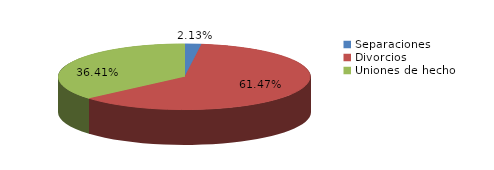
| Category | Series 0 |
|---|---|
| Separaciones | 9 |
| Divorcios | 260 |
| Uniones de hecho | 154 |